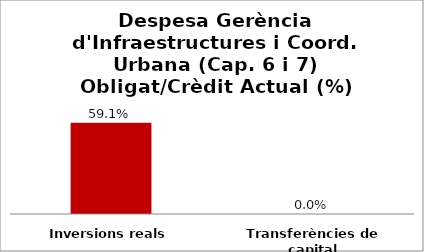
| Category | Series 0 |
|---|---|
| Inversions reals | 0.591 |
| Transferències de capital | 0 |